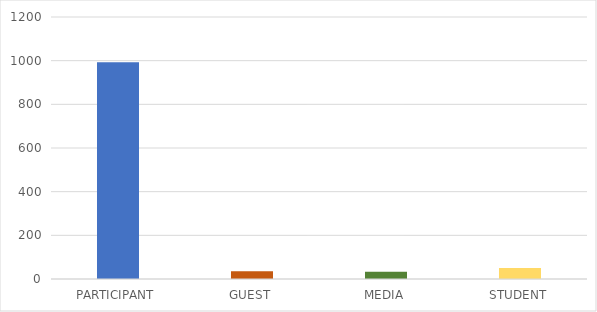
| Category | Series 0 |
|---|---|
| PARTICIPANT | 993 |
| GUEST | 35 |
| MEDIA | 33 |
| STUDENT | 50 |